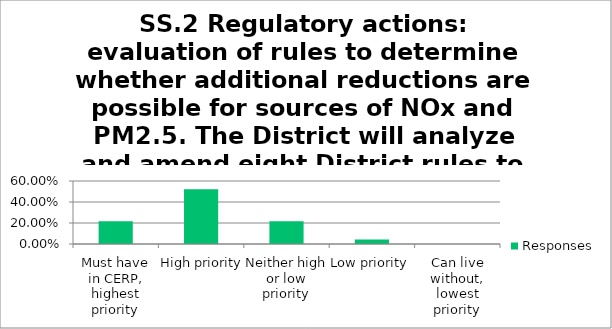
| Category | Responses |
|---|---|
| Must have in CERP, highest priority | 0.217 |
| High priority | 0.522 |
| Neither high or low priority | 0.217 |
| Low priority | 0.044 |
| Can live without, lowest priority | 0 |